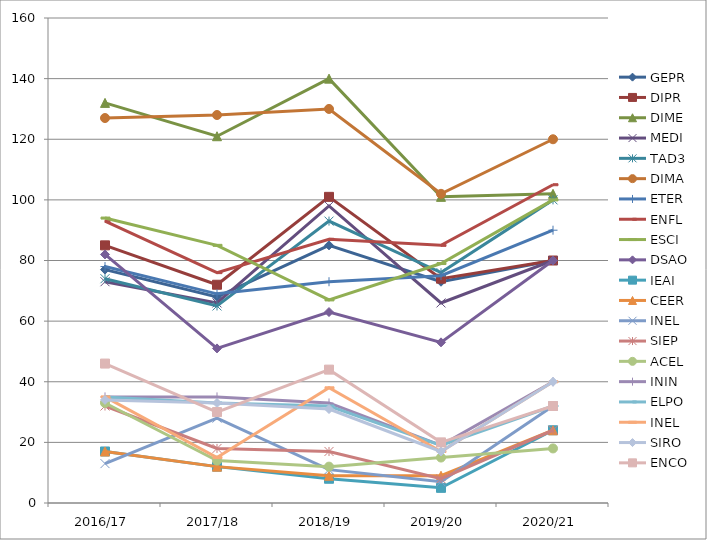
| Category | GEPR | DIPR | DIME | MEDI | TAD3 | DIMA | ETER | ENFL | ESCI | DSAO | IEAI | CEER | INEL | SIEP | ACEL | ININ | ELPO | SIRO | ENCO |
|---|---|---|---|---|---|---|---|---|---|---|---|---|---|---|---|---|---|---|---|
| 2016/17 | 77 | 85 | 132 | 73 | 74 | 127 | 78 | 93 | 94 | 82 | 17 | 17 | 35 | 32 | 33 | 35 | 35 | 34 | 46 |
| 2017/18 | 68 | 72 | 121 | 66 | 65 | 128 | 69 | 76 | 85 | 51 | 12 | 12 | 15 | 18 | 14 | 35 | 33 | 33 | 30 |
| 2018/19 | 85 | 101 | 140 | 98 | 93 | 130 | 73 | 87 | 67 | 63 | 8 | 9 | 38 | 17 | 12 | 33 | 32 | 31 | 44 |
| 2019/20 | 73 | 74 | 101 | 66 | 76 | 102 | 75 | 85 | 79 | 53 | 5 | 9 | 17 | 8 | 15 | 19 | 19 | 17 | 20 |
| 2020/21 | 80 | 80 | 102 | 80 | 100 | 120 | 90 | 105 | 100 | 80 | 24 | 24 | 40 | 24 | 18 | 40 | 32 | 40 | 32 |